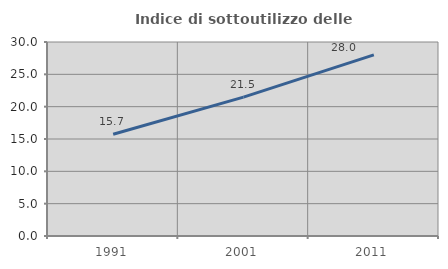
| Category | Indice di sottoutilizzo delle abitazioni  |
|---|---|
| 1991.0 | 15.728 |
| 2001.0 | 21.481 |
| 2011.0 | 28.007 |